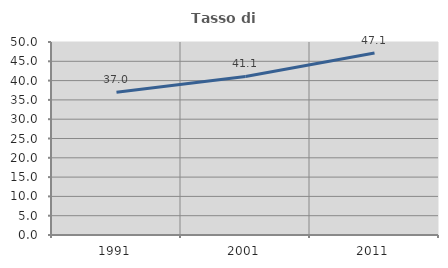
| Category | Tasso di occupazione   |
|---|---|
| 1991.0 | 36.978 |
| 2001.0 | 41.068 |
| 2011.0 | 47.143 |